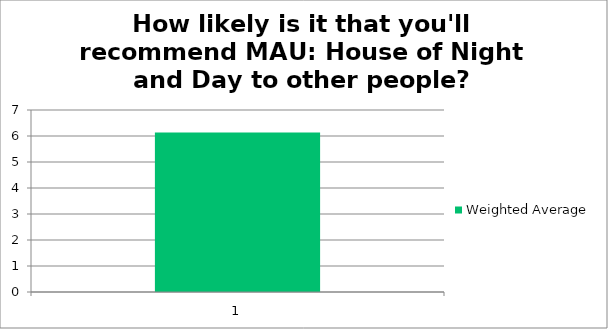
| Category | Weighted Average |
|---|---|
| 1.0 | 6.13 |